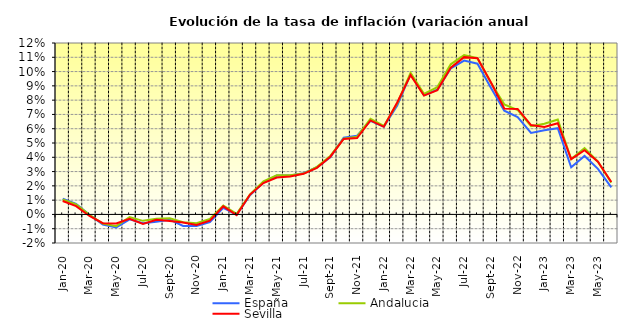
| Category | España | Andalucía | Sevilla |
|---|---|---|---|
| 2020-01-01 | 0.011 | 0.01 | 0.009 |
| 2020-02-01 | 0.007 | 0.007 | 0.006 |
| 2020-03-01 | 0 | 0 | -0.001 |
| 2020-04-01 | -0.007 | -0.006 | -0.006 |
| 2020-05-01 | -0.009 | -0.008 | -0.006 |
| 2020-06-01 | -0.003 | -0.002 | -0.003 |
| 2020-07-01 | -0.006 | -0.004 | -0.007 |
| 2020-08-01 | -0.005 | -0.003 | -0.004 |
| 2020-09-01 | -0.004 | -0.003 | -0.005 |
| 2020-10-01 | -0.008 | -0.005 | -0.006 |
| 2020-11-01 | -0.008 | -0.006 | -0.007 |
| 2020-12-01 | -0.005 | -0.003 | -0.004 |
| 2021-01-01 | 0.005 | 0.006 | 0.006 |
| 2021-02-01 | 0 | 0 | 0 |
| 2021-03-01 | 0.013 | 0.014 | 0.014 |
| 2021-04-01 | 0.022 | 0.023 | 0.022 |
| 2021-05-01 | 0.027 | 0.027 | 0.026 |
| 2021-06-01 | 0.027 | 0.027 | 0.027 |
| 2021-07-01 | 0.029 | 0.029 | 0.028 |
| 2021-08-01 | 0.033 | 0.033 | 0.033 |
| 2021-09-01 | 0.04 | 0.041 | 0.04 |
| 2021-10-01 | 0.054 | 0.053 | 0.053 |
| 2021-11-01 | 0.055 | 0.054 | 0.053 |
| 2021-12-01 | 0.065 | 0.067 | 0.066 |
| 2022-01-01 | 0.061 | 0.062 | 0.061 |
| 2022-02-01 | 0.076 | 0.078 | 0.078 |
| 2022-03-01 | 0.098 | 0.099 | 0.098 |
| 2022-04-01 | 0.083 | 0.084 | 0.083 |
| 2022-05-01 | 0.087 | 0.089 | 0.087 |
| 2022-06-01 | 0.102 | 0.105 | 0.103 |
| 2022-07-01 | 0.108 | 0.112 | 0.11 |
| 2022-08-01 | 0.105 | 0.109 | 0.109 |
| 2022-09-01 | 0.089 | 0.092 | 0.092 |
| 2022-10-01 | 0.073 | 0.077 | 0.074 |
| 2022-11-01 | 0.068 | 0.073 | 0.074 |
| 2022-12-01 | 0.057 | 0.062 | 0.063 |
| 2023-01-01 | 0.059 | 0.063 | 0.061 |
| 2023-02-01 | 0.06 | 0.066 | 0.064 |
| 2023-03-01 | 0.033 | 0.039 | 0.039 |
| 2023-04-01 | 0.041 | 0.046 | 0.045 |
| 2023-05-01 | 0.032 | 0.037 | 0.037 |
| 2023-06-01 | 0.019 | 0.022 | 0.023 |